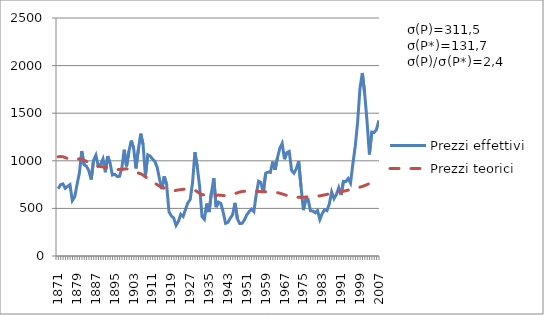
| Category | Prezzi effettivi | Prezzi teorici |
|---|---|---|
| 1871.0 | 706.72 | 1042.211 |
| 1872.0 | 749.256 | 1044.454 |
| 1873.0 | 757.6 | 1042.396 |
| 1874.0 | 710.743 | 1034.399 |
| 1875.0 | 731.559 | 1023.234 |
| 1876.0 | 750.106 | 1014.336 |
| 1877.0 | 582.014 | 1006.347 |
| 1878.0 | 621.194 | 1010.902 |
| 1879.0 | 750.219 | 1014.238 |
| 1880.0 | 872.501 | 1021.28 |
| 1881.0 | 1102.307 | 1016.457 |
| 1882.0 | 959.172 | 1005.892 |
| 1883.0 | 943.31 | 994.789 |
| 1884.0 | 895.242 | 978.158 |
| 1885.0 | 803.411 | 959.144 |
| 1886.0 | 1003.523 | 951.782 |
| 1887.0 | 1058.935 | 948.687 |
| 1888.0 | 945.879 | 942.683 |
| 1889.0 | 961.587 | 938.761 |
| 1890.0 | 1019.389 | 935.203 |
| 1891.0 | 879.813 | 933.193 |
| 1892.0 | 1048.893 | 929.213 |
| 1893.0 | 974.24 | 925.273 |
| 1894.0 | 850.44 | 913.636 |
| 1895.0 | 858.506 | 908.321 |
| 1896.0 | 836.074 | 908.009 |
| 1897.0 | 836.43 | 909.209 |
| 1898.0 | 923.973 | 912.054 |
| 1899.0 | 1116.075 | 912.382 |
| 1900.0 | 941.914 | 917.01 |
| 1901.0 | 1100.032 | 907.576 |
| 1902.0 | 1212.438 | 896.654 |
| 1903.0 | 1132.979 | 888.876 |
| 1904.0 | 920.155 | 876.765 |
| 1905.0 | 1116.233 | 871.325 |
| 1906.0 | 1285.155 | 863.744 |
| 1907.0 | 1171.425 | 849.81 |
| 1908.0 | 843.525 | 830.141 |
| 1909.0 | 1062.09 | 816.964 |
| 1910.0 | 1050.262 | 804.299 |
| 1911.0 | 1018.339 | 785.333 |
| 1912.0 | 995.443 | 765.928 |
| 1913.0 | 930.359 | 749.016 |
| 1914.0 | 806.92 | 733.161 |
| 1915.0 | 702.096 | 723.515 |
| 1916.0 | 836.326 | 714.354 |
| 1917.0 | 749.833 | 699.489 |
| 1918.0 | 464.255 | 683.468 |
| 1919.0 | 421.742 | 680.603 |
| 1920.0 | 398.819 | 684.306 |
| 1921.0 | 320.774 | 689.089 |
| 1922.0 | 364.108 | 694.131 |
| 1923.0 | 439.123 | 697.159 |
| 1924.0 | 416.036 | 700.501 |
| 1925.0 | 490.194 | 703.468 |
| 1926.0 | 557.028 | 705.618 |
| 1927.0 | 593.495 | 703.715 |
| 1928.0 | 772.32 | 698.371 |
| 1929.0 | 1089.627 | 689.478 |
| 1930.0 | 935.724 | 675.672 |
| 1931.0 | 728.408 | 658.443 |
| 1932.0 | 413.665 | 644.316 |
| 1933.0 | 385.189 | 643.32 |
| 1934.0 | 550.295 | 646.475 |
| 1935.0 | 461.436 | 650.306 |
| 1936.0 | 664.493 | 654.02 |
| 1937.0 | 817.54 | 647.118 |
| 1938.0 | 513.272 | 637.094 |
| 1939.0 | 565.805 | 639.883 |
| 1940.0 | 551.424 | 638.076 |
| 1941.0 | 458.501 | 634.872 |
| 1942.0 | 342.744 | 633.406 |
| 1943.0 | 353.78 | 638.443 |
| 1944.0 | 396.835 | 643.945 |
| 1945.0 | 434.254 | 649.496 |
| 1946.0 | 557.887 | 655.441 |
| 1947.0 | 391.981 | 663.763 |
| 1948.0 | 340.94 | 671.409 |
| 1949.0 | 342.907 | 677.915 |
| 1950.0 | 378.453 | 679.888 |
| 1951.0 | 432.639 | 677.516 |
| 1952.0 | 465.072 | 677.923 |
| 1953.0 | 493.093 | 678.899 |
| 1954.0 | 466.292 | 679.915 |
| 1955.0 | 645.955 | 679.586 |
| 1956.0 | 784.821 | 678.033 |
| 1957.0 | 771.116 | 676.036 |
| 1958.0 | 662.345 | 674.659 |
| 1959.0 | 868.843 | 674.722 |
| 1960.0 | 882.276 | 674.302 |
| 1961.0 | 877.878 | 673.023 |
| 1962.0 | 991.768 | 671.351 |
| 1963.0 | 906.553 | 668.938 |
| 1964.0 | 1030.583 | 665.37 |
| 1965.0 | 1130.641 | 659.571 |
| 1966.0 | 1182.045 | 651.905 |
| 1967.0 | 1016.72 | 643.828 |
| 1968.0 | 1085.577 | 636.623 |
| 1969.0 | 1097.843 | 629.449 |
| 1970.0 | 899.86 | 623.526 |
| 1971.0 | 870.01 | 619.629 |
| 1972.0 | 915.402 | 617.589 |
| 1973.0 | 995.589 | 616.188 |
| 1974.0 | 726.371 | 615.668 |
| 1975.0 | 482.333 | 616.742 |
| 1976.0 | 593.291 | 619.249 |
| 1977.0 | 594.282 | 621.214 |
| 1978.0 | 475.541 | 621.836 |
| 1979.0 | 472.77 | 623.052 |
| 1980.0 | 453.813 | 625.23 |
| 1981.0 | 478.617 | 628.45 |
| 1982.0 | 382.981 | 632.323 |
| 1983.0 | 446.698 | 636.732 |
| 1984.0 | 486.229 | 641.873 |
| 1985.0 | 476.309 | 647.042 |
| 1986.0 | 546.965 | 652.565 |
| 1987.0 | 673.532 | 657.984 |
| 1988.0 | 602.798 | 663.505 |
| 1989.0 | 645.31 | 668.408 |
| 1990.0 | 718.499 | 672.18 |
| 1991.0 | 640.283 | 675.697 |
| 1992.0 | 784.441 | 680.138 |
| 1993.0 | 781.426 | 685.516 |
| 1994.0 | 814.524 | 691.693 |
| 1995.0 | 766.369 | 698.091 |
| 1996.0 | 968.813 | 704.699 |
| 1997.0 | 1152.966 | 710.898 |
| 1998.0 | 1403.432 | 717.19 |
| 1999.0 | 1759.545 | 723.491 |
| 2000.0 | 1922.599 | 730.365 |
| 2001.0 | 1707.567 | 739.227 |
| 2002.0 | 1417.279 | 749.685 |
| 2003.0 | 1067.273 | 760.987 |
| 2004.0 | 1301.716 | 771.905 |
| 2005.0 | 1296.798 | 781.916 |
| 2006.0 | 1327.363 | 790.607 |
| 2007.0 | 1424.16 | 797.836 |